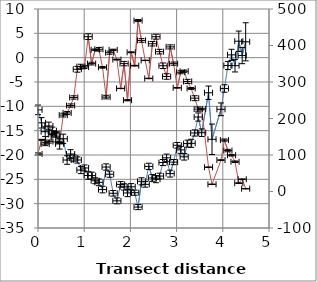
| Category | Series 0 |
|---|---|
| 0.0 | -10.724 |
| 76.11832893594026 | -13.39 |
| 155.36477996057607 | -15.208 |
| 234.61123098521188 | -14.041 |
| 311.03112368338304 | -15.017 |
| 385.46229994709665 | -16.349 |
| 468.6608576269026 | -17.715 |
| 547.1082922567234 | -16.667 |
| 630.3068499365294 | -21.031 |
| 705.6328082775954 | -19.806 |
| 773.698952578562 | -20.634 |
| 850.6404888252473 | -21.026 |
| 928.7301808466659 | -23.091 |
| 1007.5020032198978 | -22.668 |
| 1086.4196818476933 | -24.21 |
| 1160.39940880042 | -24.237 |
| 1238.0460442716367 | -25.29 |
| 1317.8081906820737 | -25.62 |
| 1397.1177109176672 | -27.105 |
| 1474.279877813109 | -22.471 |
| 1550.9349494000562 | -23.947 |
| 1627.4659888546462 | -27.871 |
| 1707.6906733351725 | -29.418 |
| 1788.740041006981 | -26.032 |
| 1863.4126598173589 | -26.561 |
| 1937.3923867700855 | -27.802 |
| 2016.6388377947214 | -26.526 |
| 2093.0587304928927 | -27.745 |
| 2165.894161431413 | -30.703 |
| 2241.0606433232774 | -25.408 |
| 2320.3070943479133 | -26.035 |
| 2397.95372981913 | -22.343 |
| 2476.7255521923616 | -24.715 |
| 2553.2565916469516 | -24.972 |
| 2631.038337577472 | -24.323 |
| 2705.5635011130184 | -21.55 |
| 2783.7939299754503 | -20.569 |
| 2860.3249694300403 | -23.827 |
| 2934.9975882404183 | -21.461 |
| 3014.4016183648396 | -18.007 |
| 3088.2257336660064 | -18.951 |
| 3163.465350889913 | -20.373 |
| 3238.8908107824454 | -17.658 |
| 3315.055106879764 | -17.603 |
| 3391.4749995779353 | -15.477 |
| 3468.006039032525 | -12.197 |
| 3542.5513272806766 | -15.417 |
| 3691.25909439457 | -7.211 |
| 3766.25909439457 | -16.774 |
| 3960.439422955421 | -10.613 |
| 4035.439422955421 | -6.33 |
| 4110.439422955421 | -1.611 |
| 4189.211245328653 | 0.574 |
| 4264.211245328653 | -1.642 |
| 4345.954746599396 | 3.373 |
| 4419.934473552123 | 0.433 |
| 4494.934473552123 | 3.259 |